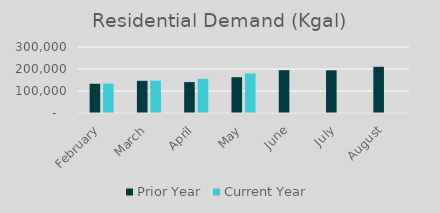
| Category | Prior Year | Current Year |
|---|---|---|
| February | 132905 | 133616 |
| March | 146212 | 146882 |
| April | 140621 | 154955 |
| May | 162790 | 179419 |
| June | 194665 | 0 |
| July | 194086 | 0 |
| August | 209888 | 0 |